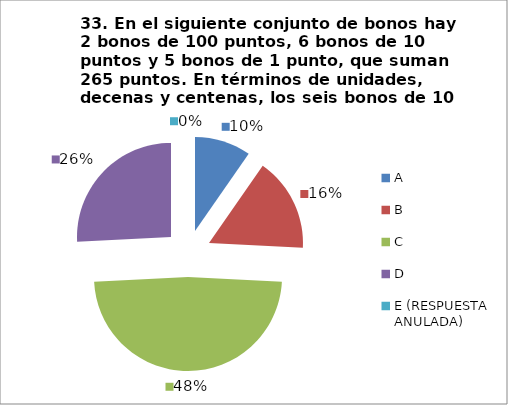
| Category | CANTIDAD DE RESPUESTAS PREGUNTA (33) | PORCENTAJE |
|---|---|---|
| A | 3 | 0.097 |
| B | 5 | 0.161 |
| C | 15 | 0.484 |
| D | 8 | 0.258 |
| E (RESPUESTA ANULADA) | 0 | 0 |